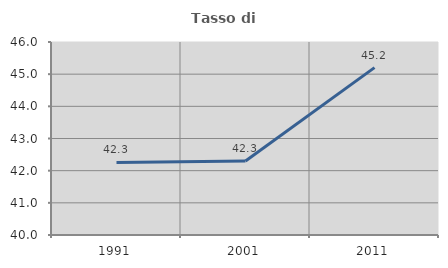
| Category | Tasso di occupazione   |
|---|---|
| 1991.0 | 42.255 |
| 2001.0 | 42.303 |
| 2011.0 | 45.204 |